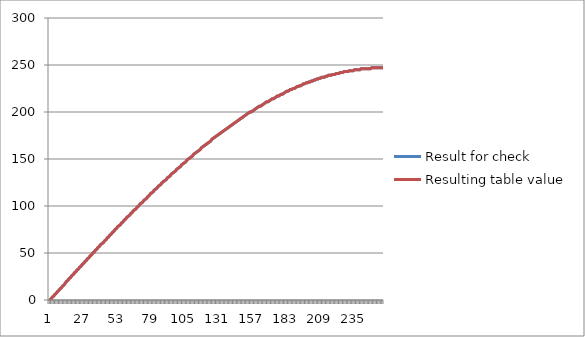
| Category | Result for check | Resulting table value |
|---|---|---|
| 0 | 0 | 0 |
| 1 | 1 | 1 |
| 2 | 3 | 3 |
| 3 | 4 | 4 |
| 4 | 6 | 6 |
| 5 | 7 | 7 |
| 6 | 9 | 9 |
| 7 | 10 | 10 |
| 8 | 12 | 12 |
| 9 | 13 | 13 |
| 10 | 15 | 15 |
| 11 | 16 | 16 |
| 12 | 18 | 18 |
| 13 | 20 | 20 |
| 14 | 21 | 21 |
| 15 | 23 | 23 |
| 16 | 24 | 24 |
| 17 | 26 | 26 |
| 18 | 27 | 27 |
| 19 | 29 | 29 |
| 20 | 30 | 30 |
| 21 | 32 | 32 |
| 22 | 33 | 33 |
| 23 | 35 | 35 |
| 24 | 36 | 36 |
| 25 | 38 | 38 |
| 26 | 39 | 39 |
| 27 | 41 | 41 |
| 28 | 42 | 42 |
| 29 | 44 | 44 |
| 30 | 45 | 45 |
| 31 | 47 | 47 |
| 32 | 48 | 48 |
| 33 | 50 | 50 |
| 34 | 51 | 51 |
| 35 | 53 | 53 |
| 36 | 54 | 54 |
| 37 | 56 | 56 |
| 38 | 57 | 57 |
| 39 | 59 | 59 |
| 40 | 60 | 60 |
| 41 | 61 | 61 |
| 42 | 63 | 63 |
| 43 | 64 | 64 |
| 44 | 66 | 66 |
| 45 | 67 | 67 |
| 46 | 69 | 69 |
| 47 | 70 | 70 |
| 48 | 72 | 72 |
| 49 | 73 | 73 |
| 50 | 75 | 75 |
| 51 | 76 | 76 |
| 52 | 78 | 78 |
| 53 | 79 | 79 |
| 54 | 80 | 80 |
| 55 | 82 | 82 |
| 56 | 83 | 83 |
| 57 | 85 | 85 |
| 58 | 86 | 86 |
| 59 | 88 | 88 |
| 60 | 89 | 89 |
| 61 | 90 | 90 |
| 62 | 92 | 92 |
| 63 | 93 | 93 |
| 64 | 95 | 95 |
| 65 | 96 | 96 |
| 66 | 97 | 97 |
| 67 | 99 | 99 |
| 68 | 100 | 100 |
| 69 | 102 | 102 |
| 70 | 103 | 103 |
| 71 | 104 | 104 |
| 72 | 106 | 106 |
| 73 | 107 | 107 |
| 74 | 108 | 108 |
| 75 | 110 | 110 |
| 76 | 111 | 111 |
| 77 | 113 | 113 |
| 78 | 114 | 114 |
| 79 | 115 | 115 |
| 80 | 117 | 117 |
| 81 | 118 | 118 |
| 82 | 119 | 119 |
| 83 | 121 | 121 |
| 84 | 122 | 122 |
| 85 | 123 | 123 |
| 86 | 125 | 125 |
| 87 | 126 | 126 |
| 88 | 127 | 127 |
| 89 | 128 | 128 |
| 90 | 130 | 130 |
| 91 | 131 | 131 |
| 92 | 132 | 132 |
| 93 | 134 | 134 |
| 94 | 135 | 135 |
| 95 | 136 | 136 |
| 96 | 137 | 137 |
| 97 | 139 | 139 |
| 98 | 140 | 140 |
| 99 | 141 | 141 |
| 100 | 142 | 142 |
| 101 | 144 | 144 |
| 102 | 145 | 145 |
| 103 | 146 | 146 |
| 104 | 147 | 147 |
| 105 | 149 | 149 |
| 106 | 150 | 150 |
| 107 | 151 | 151 |
| 108 | 152 | 152 |
| 109 | 153 | 153 |
| 110 | 155 | 155 |
| 111 | 156 | 156 |
| 112 | 157 | 157 |
| 113 | 158 | 158 |
| 114 | 159 | 159 |
| 115 | 160 | 160 |
| 116 | 162 | 162 |
| 117 | 163 | 163 |
| 118 | 164 | 164 |
| 119 | 165 | 165 |
| 120 | 166 | 166 |
| 121 | 167 | 167 |
| 122 | 168 | 168 |
| 123 | 169 | 169 |
| 124 | 171 | 171 |
| 125 | 172 | 172 |
| 126 | 173 | 173 |
| 127 | 174 | 174 |
| 128 | 175 | 175 |
| 129 | 176 | 176 |
| 130 | 177 | 177 |
| 131 | 178 | 178 |
| 132 | 179 | 179 |
| 133 | 180 | 180 |
| 134 | 181 | 181 |
| 135 | 182 | 182 |
| 136 | 183 | 183 |
| 137 | 184 | 184 |
| 138 | 185 | 185 |
| 139 | 186 | 186 |
| 140 | 187 | 187 |
| 141 | 188 | 188 |
| 142 | 189 | 189 |
| 143 | 190 | 190 |
| 144 | 191 | 191 |
| 145 | 192 | 192 |
| 146 | 193 | 193 |
| 147 | 194 | 194 |
| 148 | 195 | 195 |
| 149 | 196 | 196 |
| 150 | 197 | 197 |
| 151 | 198 | 198 |
| 152 | 199 | 199 |
| 153 | 200 | 200 |
| 154 | 200 | 200 |
| 155 | 201 | 201 |
| 156 | 202 | 202 |
| 157 | 203 | 203 |
| 158 | 204 | 204 |
| 159 | 205 | 205 |
| 160 | 206 | 206 |
| 161 | 206 | 206 |
| 162 | 207 | 207 |
| 163 | 208 | 208 |
| 164 | 209 | 209 |
| 165 | 210 | 210 |
| 166 | 211 | 211 |
| 167 | 211 | 211 |
| 168 | 212 | 212 |
| 169 | 213 | 213 |
| 170 | 214 | 214 |
| 171 | 214 | 214 |
| 172 | 215 | 215 |
| 173 | 216 | 216 |
| 174 | 217 | 217 |
| 175 | 217 | 217 |
| 176 | 218 | 218 |
| 177 | 219 | 219 |
| 178 | 219 | 219 |
| 179 | 220 | 220 |
| 180 | 221 | 221 |
| 181 | 222 | 222 |
| 182 | 222 | 222 |
| 183 | 223 | 223 |
| 184 | 224 | 224 |
| 185 | 224 | 224 |
| 186 | 225 | 225 |
| 187 | 225 | 225 |
| 188 | 226 | 226 |
| 189 | 227 | 227 |
| 190 | 227 | 227 |
| 191 | 228 | 228 |
| 192 | 228 | 228 |
| 193 | 229 | 229 |
| 194 | 230 | 230 |
| 195 | 230 | 230 |
| 196 | 231 | 231 |
| 197 | 231 | 231 |
| 198 | 232 | 232 |
| 199 | 232 | 232 |
| 200 | 233 | 233 |
| 201 | 233 | 233 |
| 202 | 234 | 234 |
| 203 | 234 | 234 |
| 204 | 235 | 235 |
| 205 | 235 | 235 |
| 206 | 236 | 236 |
| 207 | 236 | 236 |
| 208 | 237 | 237 |
| 209 | 237 | 237 |
| 210 | 237 | 237 |
| 211 | 238 | 238 |
| 212 | 238 | 238 |
| 213 | 239 | 239 |
| 214 | 239 | 239 |
| 215 | 239 | 239 |
| 216 | 240 | 240 |
| 217 | 240 | 240 |
| 218 | 240 | 240 |
| 219 | 241 | 241 |
| 220 | 241 | 241 |
| 221 | 241 | 241 |
| 222 | 242 | 242 |
| 223 | 242 | 242 |
| 224 | 242 | 242 |
| 225 | 243 | 243 |
| 226 | 243 | 243 |
| 227 | 243 | 243 |
| 228 | 243 | 243 |
| 229 | 244 | 244 |
| 230 | 244 | 244 |
| 231 | 244 | 244 |
| 232 | 244 | 244 |
| 233 | 245 | 245 |
| 234 | 245 | 245 |
| 235 | 245 | 245 |
| 236 | 245 | 245 |
| 237 | 245 | 245 |
| 238 | 246 | 246 |
| 239 | 246 | 246 |
| 240 | 246 | 246 |
| 241 | 246 | 246 |
| 242 | 246 | 246 |
| 243 | 246 | 246 |
| 244 | 246 | 246 |
| 245 | 246 | 246 |
| 246 | 247 | 247 |
| 247 | 247 | 247 |
| 248 | 247 | 247 |
| 249 | 247 | 247 |
| 250 | 247 | 247 |
| 251 | 247 | 247 |
| 252 | 247 | 247 |
| 253 | 247 | 247 |
| 254 | 247 | 247 |
| 255 | 247 | 247 |